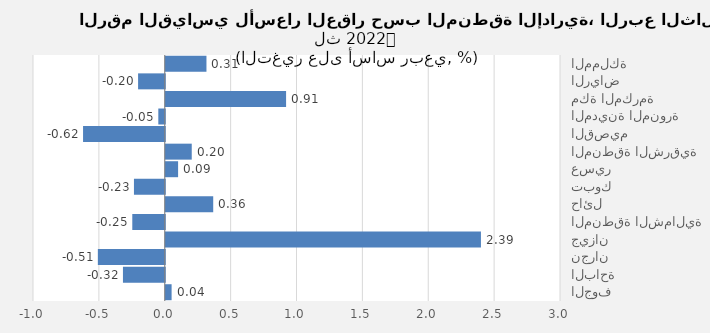
| Category | 2022 |
|---|---|
| المملكة | 0.309 |
| الرياض | -0.202 |
| مكة المكرمة | 0.913 |
| المدينة المنورة | -0.049 |
| القصيم | -0.62 |
| المنطقة الشرقية | 0.197 |
| عسير | 0.094 |
| تبوك | -0.234 |
| حائل | 0.36 |
| المنطقة الشمالية | -0.246 |
| جيزان | 2.392 |
| نجران | -0.508 |
| الباحة | -0.317 |
| الجوف | 0.044 |